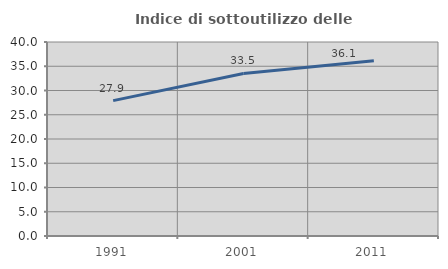
| Category | Indice di sottoutilizzo delle abitazioni  |
|---|---|
| 1991.0 | 27.919 |
| 2001.0 | 33.511 |
| 2011.0 | 36.116 |